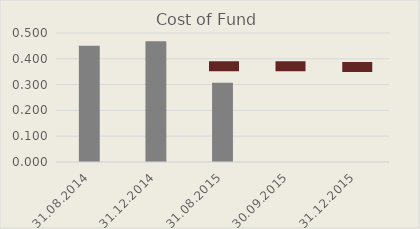
| Category | Cost of Fund |
|---|---|
| 31.08.2014 | 0.45 |
| 31.12.2014 | 0.468 |
| 31.08.2015 | 0.307 |
| 30.09.2015 | 0 |
| 31.12.2015 | 0 |